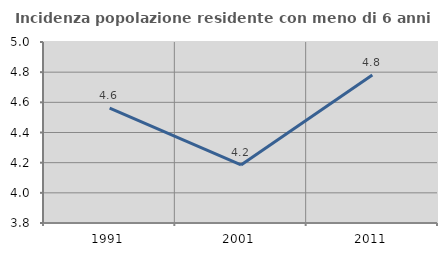
| Category | Incidenza popolazione residente con meno di 6 anni |
|---|---|
| 1991.0 | 4.562 |
| 2001.0 | 4.185 |
| 2011.0 | 4.781 |